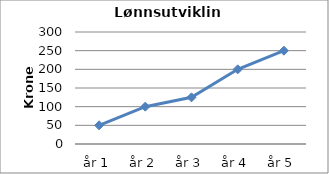
| Category | Series 0 |
|---|---|
| år 1 | 50 |
| år 2 | 100 |
| år 3 | 125 |
| år 4 | 200 |
| år 5 | 250 |